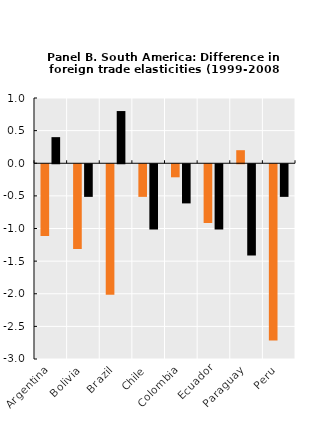
| Category | Income elasticity of exports | Income elasticity of imports |
|---|---|---|
| Argentina | -1.1 | 0.4 |
| Bolivia | -1.3 | -0.5 |
| Brazil | -2 | 0.8 |
| Chile | -0.5 | -1 |
| Colombia | -0.2 | -0.6 |
| Ecuador | -0.9 | -1 |
| Paraguay | 0.2 | -1.4 |
| Peru | -2.7 | -0.5 |